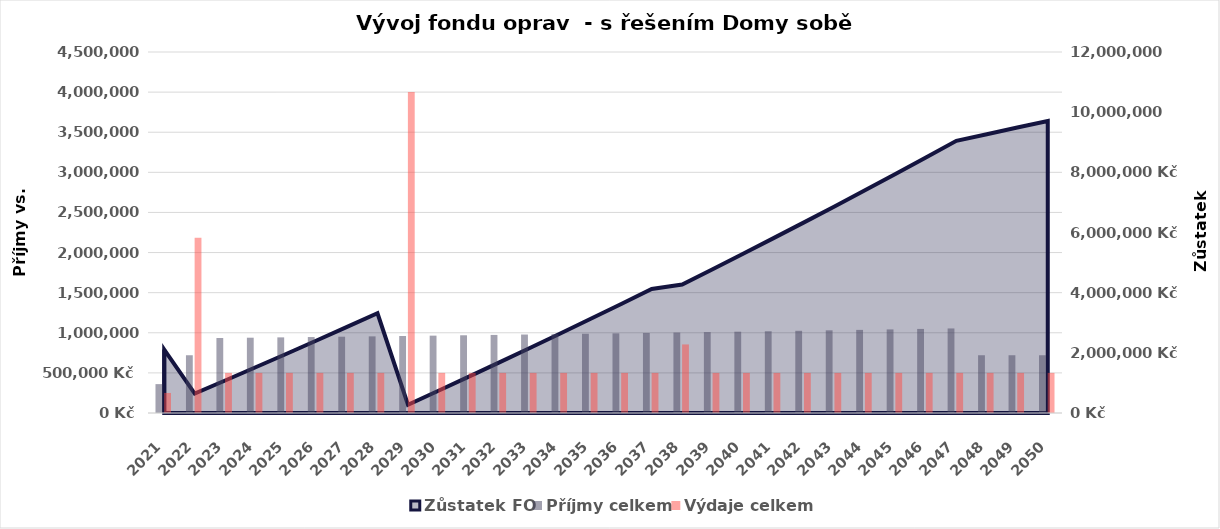
| Category | Příjmy celkem | Výdaje celkem |
|---|---|---|
| 2021.0 | 360000 | 250000 |
| 2022.0 | 720000 | 2183705 |
| 2023.0 | 934687 | 500000 |
| 2024.0 | 938691 | 500000 |
| 2025.0 | 942768 | 500000 |
| 2026.0 | 946921 | 500000 |
| 2027.0 | 951150 | 500000 |
| 2028.0 | 955458 | 500000 |
| 2029.0 | 959845 | 4000000 |
| 2030.0 | 964313 | 500000 |
| 2031.0 | 968864 | 500000 |
| 2032.0 | 973499 | 500000 |
| 2033.0 | 978219 | 500000 |
| 2034.0 | 983026 | 500000 |
| 2035.0 | 987922 | 500000 |
| 2036.0 | 992909 | 500000 |
| 2037.0 | 997987 | 500000 |
| 2038.0 | 1003159.01 | 854861 |
| 2039.0 | 1008426 | 500000 |
| 2040.0 | 1013791 | 500000 |
| 2041.0 | 1019254 | 500000 |
| 2042.0 | 1024818 | 500000 |
| 2043.0 | 1030485 | 500000 |
| 2044.0 | 1036256 | 500000 |
| 2045.0 | 1042133 | 500000 |
| 2046.0 | 1048118 | 500000 |
| 2047.0 | 1054214 | 500000 |
| 2048.0 | 720000 | 500000 |
| 2049.0 | 720000 | 500000 |
| 2050.0 | 720000 | 500000 |